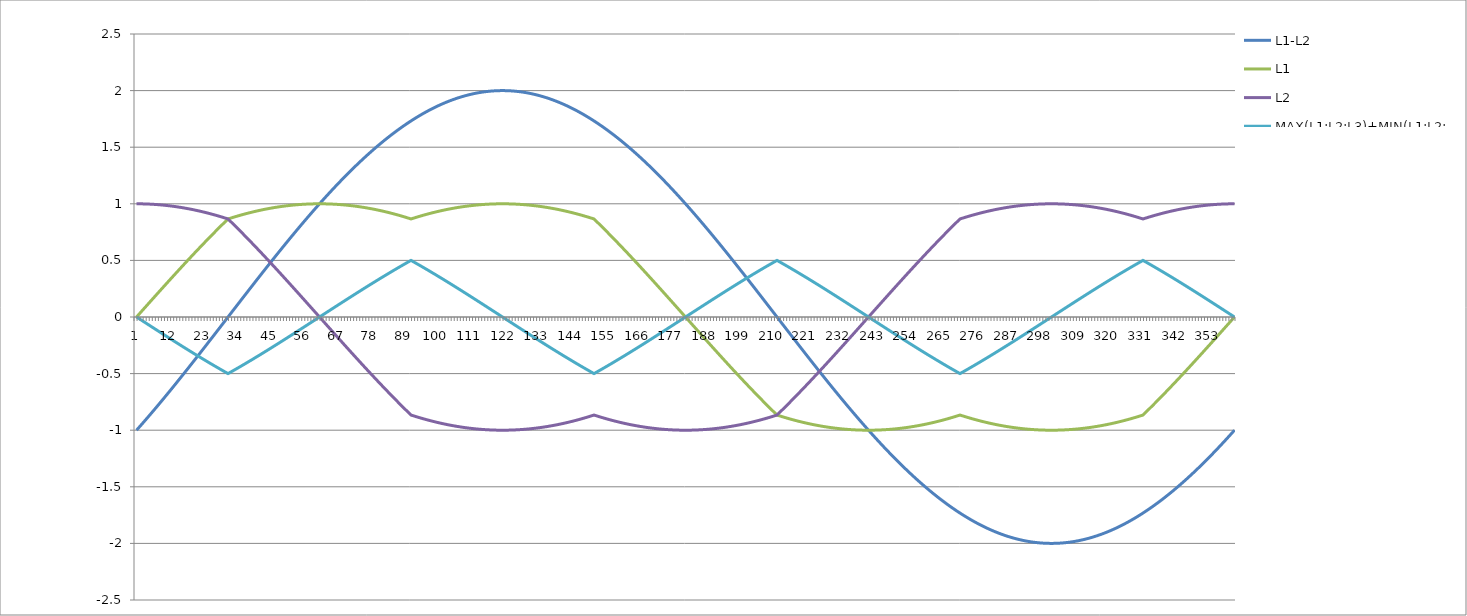
| Category | L1-L2 | L1 | L2 | MAX(L1;L2;L3)+MIN(L1;L2;L3) |
|---|---|---|---|---|
| 0 | -1 | 0 | 1 | 0 |
| 1 | -0.97 | 0.03 | 1 | -0.017 |
| 2 | -0.939 | 0.06 | 0.999 | -0.035 |
| 3 | -0.908 | 0.091 | 0.999 | -0.052 |
| 4 | -0.877 | 0.121 | 0.998 | -0.07 |
| 5 | -0.845 | 0.151 | 0.996 | -0.087 |
| 6 | -0.813 | 0.181 | 0.995 | -0.105 |
| 7 | -0.781 | 0.211 | 0.993 | -0.122 |
| 8 | -0.749 | 0.241 | 0.99 | -0.139 |
| 9 | -0.717 | 0.271 | 0.988 | -0.156 |
| 10 | -0.684 | 0.301 | 0.985 | -0.174 |
| 11 | -0.651 | 0.33 | 0.982 | -0.191 |
| 12 | -0.618 | 0.36 | 0.978 | -0.208 |
| 13 | -0.585 | 0.39 | 0.974 | -0.225 |
| 14 | -0.551 | 0.419 | 0.97 | -0.242 |
| 15 | -0.518 | 0.448 | 0.966 | -0.259 |
| 16 | -0.484 | 0.477 | 0.961 | -0.276 |
| 17 | -0.45 | 0.506 | 0.956 | -0.292 |
| 18 | -0.416 | 0.535 | 0.951 | -0.309 |
| 19 | -0.382 | 0.564 | 0.946 | -0.326 |
| 20 | -0.347 | 0.592 | 0.94 | -0.342 |
| 21 | -0.313 | 0.621 | 0.934 | -0.358 |
| 22 | -0.278 | 0.649 | 0.927 | -0.375 |
| 23 | -0.244 | 0.677 | 0.921 | -0.391 |
| 24 | -0.209 | 0.704 | 0.914 | -0.407 |
| 25 | -0.174 | 0.732 | 0.906 | -0.423 |
| 26 | -0.14 | 0.759 | 0.899 | -0.438 |
| 27 | -0.105 | 0.786 | 0.891 | -0.454 |
| 28 | -0.07 | 0.813 | 0.883 | -0.469 |
| 29 | -0.035 | 0.84 | 0.875 | -0.485 |
| 30 | 0 | 0.866 | 0.866 | -0.5 |
| 31 | 0.035 | 0.875 | 0.84 | -0.485 |
| 32 | 0.07 | 0.883 | 0.813 | -0.469 |
| 33 | 0.105 | 0.891 | 0.786 | -0.454 |
| 34 | 0.14 | 0.899 | 0.759 | -0.438 |
| 35 | 0.174 | 0.906 | 0.732 | -0.423 |
| 36 | 0.209 | 0.914 | 0.704 | -0.407 |
| 37 | 0.244 | 0.921 | 0.677 | -0.391 |
| 38 | 0.278 | 0.927 | 0.649 | -0.375 |
| 39 | 0.313 | 0.934 | 0.621 | -0.358 |
| 40 | 0.347 | 0.94 | 0.592 | -0.342 |
| 41 | 0.382 | 0.946 | 0.564 | -0.326 |
| 42 | 0.416 | 0.951 | 0.535 | -0.309 |
| 43 | 0.45 | 0.956 | 0.506 | -0.292 |
| 44 | 0.484 | 0.961 | 0.477 | -0.276 |
| 45 | 0.518 | 0.966 | 0.448 | -0.259 |
| 46 | 0.551 | 0.97 | 0.419 | -0.242 |
| 47 | 0.585 | 0.974 | 0.39 | -0.225 |
| 48 | 0.618 | 0.978 | 0.36 | -0.208 |
| 49 | 0.651 | 0.982 | 0.33 | -0.191 |
| 50 | 0.684 | 0.985 | 0.301 | -0.174 |
| 51 | 0.717 | 0.988 | 0.271 | -0.156 |
| 52 | 0.749 | 0.99 | 0.241 | -0.139 |
| 53 | 0.781 | 0.993 | 0.211 | -0.122 |
| 54 | 0.813 | 0.995 | 0.181 | -0.105 |
| 55 | 0.845 | 0.996 | 0.151 | -0.087 |
| 56 | 0.877 | 0.998 | 0.121 | -0.07 |
| 57 | 0.908 | 0.999 | 0.091 | -0.052 |
| 58 | 0.939 | 0.999 | 0.06 | -0.035 |
| 59 | 0.97 | 1 | 0.03 | -0.017 |
| 60 | 1 | 1 | 0 | 0 |
| 61 | 1.03 | 1 | -0.03 | 0.017 |
| 62 | 1.06 | 0.999 | -0.06 | 0.035 |
| 63 | 1.089 | 0.999 | -0.091 | 0.052 |
| 64 | 1.118 | 0.998 | -0.121 | 0.07 |
| 65 | 1.147 | 0.996 | -0.151 | 0.087 |
| 66 | 1.176 | 0.995 | -0.181 | 0.105 |
| 67 | 1.204 | 0.993 | -0.211 | 0.122 |
| 68 | 1.231 | 0.99 | -0.241 | 0.139 |
| 69 | 1.259 | 0.988 | -0.271 | 0.156 |
| 70 | 1.286 | 0.985 | -0.301 | 0.174 |
| 71 | 1.312 | 0.982 | -0.33 | 0.191 |
| 72 | 1.338 | 0.978 | -0.36 | 0.208 |
| 73 | 1.364 | 0.974 | -0.39 | 0.225 |
| 74 | 1.389 | 0.97 | -0.419 | 0.242 |
| 75 | 1.414 | 0.966 | -0.448 | 0.259 |
| 76 | 1.439 | 0.961 | -0.477 | 0.276 |
| 77 | 1.463 | 0.956 | -0.506 | 0.292 |
| 78 | 1.486 | 0.951 | -0.535 | 0.309 |
| 79 | 1.509 | 0.946 | -0.564 | 0.326 |
| 80 | 1.532 | 0.94 | -0.592 | 0.342 |
| 81 | 1.554 | 0.934 | -0.621 | 0.358 |
| 82 | 1.576 | 0.927 | -0.649 | 0.375 |
| 83 | 1.597 | 0.921 | -0.677 | 0.391 |
| 84 | 1.618 | 0.914 | -0.704 | 0.407 |
| 85 | 1.638 | 0.906 | -0.732 | 0.423 |
| 86 | 1.658 | 0.899 | -0.759 | 0.438 |
| 87 | 1.677 | 0.891 | -0.786 | 0.454 |
| 88 | 1.696 | 0.883 | -0.813 | 0.469 |
| 89 | 1.714 | 0.875 | -0.84 | 0.485 |
| 90 | 1.732 | 0.866 | -0.866 | 0.5 |
| 91 | 1.749 | 0.875 | -0.875 | 0.485 |
| 92 | 1.766 | 0.883 | -0.883 | 0.469 |
| 93 | 1.782 | 0.891 | -0.891 | 0.454 |
| 94 | 1.798 | 0.899 | -0.899 | 0.438 |
| 95 | 1.813 | 0.906 | -0.906 | 0.423 |
| 96 | 1.827 | 0.914 | -0.914 | 0.407 |
| 97 | 1.841 | 0.921 | -0.921 | 0.391 |
| 98 | 1.854 | 0.927 | -0.927 | 0.375 |
| 99 | 1.867 | 0.934 | -0.934 | 0.358 |
| 100 | 1.879 | 0.94 | -0.94 | 0.342 |
| 101 | 1.891 | 0.946 | -0.946 | 0.326 |
| 102 | 1.902 | 0.951 | -0.951 | 0.309 |
| 103 | 1.913 | 0.956 | -0.956 | 0.292 |
| 104 | 1.923 | 0.961 | -0.961 | 0.276 |
| 105 | 1.932 | 0.966 | -0.966 | 0.259 |
| 106 | 1.941 | 0.97 | -0.97 | 0.242 |
| 107 | 1.949 | 0.974 | -0.974 | 0.225 |
| 108 | 1.956 | 0.978 | -0.978 | 0.208 |
| 109 | 1.963 | 0.982 | -0.982 | 0.191 |
| 110 | 1.97 | 0.985 | -0.985 | 0.174 |
| 111 | 1.975 | 0.988 | -0.988 | 0.156 |
| 112 | 1.981 | 0.99 | -0.99 | 0.139 |
| 113 | 1.985 | 0.993 | -0.993 | 0.122 |
| 114 | 1.989 | 0.995 | -0.995 | 0.105 |
| 115 | 1.992 | 0.996 | -0.996 | 0.087 |
| 116 | 1.995 | 0.998 | -0.998 | 0.07 |
| 117 | 1.997 | 0.999 | -0.999 | 0.052 |
| 118 | 1.999 | 0.999 | -0.999 | 0.035 |
| 119 | 2 | 1 | -1 | 0.017 |
| 120 | 2 | 1 | -1 | 0 |
| 121 | 2 | 1 | -1 | -0.017 |
| 122 | 1.999 | 0.999 | -0.999 | -0.035 |
| 123 | 1.997 | 0.999 | -0.999 | -0.052 |
| 124 | 1.995 | 0.998 | -0.998 | -0.07 |
| 125 | 1.992 | 0.996 | -0.996 | -0.087 |
| 126 | 1.989 | 0.995 | -0.995 | -0.105 |
| 127 | 1.985 | 0.993 | -0.993 | -0.122 |
| 128 | 1.981 | 0.99 | -0.99 | -0.139 |
| 129 | 1.975 | 0.988 | -0.988 | -0.156 |
| 130 | 1.97 | 0.985 | -0.985 | -0.174 |
| 131 | 1.963 | 0.982 | -0.982 | -0.191 |
| 132 | 1.956 | 0.978 | -0.978 | -0.208 |
| 133 | 1.949 | 0.974 | -0.974 | -0.225 |
| 134 | 1.941 | 0.97 | -0.97 | -0.242 |
| 135 | 1.932 | 0.966 | -0.966 | -0.259 |
| 136 | 1.923 | 0.961 | -0.961 | -0.276 |
| 137 | 1.913 | 0.956 | -0.956 | -0.292 |
| 138 | 1.902 | 0.951 | -0.951 | -0.309 |
| 139 | 1.891 | 0.946 | -0.946 | -0.326 |
| 140 | 1.879 | 0.94 | -0.94 | -0.342 |
| 141 | 1.867 | 0.934 | -0.934 | -0.358 |
| 142 | 1.854 | 0.927 | -0.927 | -0.375 |
| 143 | 1.841 | 0.921 | -0.921 | -0.391 |
| 144 | 1.827 | 0.914 | -0.914 | -0.407 |
| 145 | 1.813 | 0.906 | -0.906 | -0.423 |
| 146 | 1.798 | 0.899 | -0.899 | -0.438 |
| 147 | 1.782 | 0.891 | -0.891 | -0.454 |
| 148 | 1.766 | 0.883 | -0.883 | -0.469 |
| 149 | 1.749 | 0.875 | -0.875 | -0.485 |
| 150 | 1.732 | 0.866 | -0.866 | -0.5 |
| 151 | 1.714 | 0.84 | -0.875 | -0.485 |
| 152 | 1.696 | 0.813 | -0.883 | -0.469 |
| 153 | 1.677 | 0.786 | -0.891 | -0.454 |
| 154 | 1.658 | 0.759 | -0.899 | -0.438 |
| 155 | 1.638 | 0.732 | -0.906 | -0.423 |
| 156 | 1.618 | 0.704 | -0.914 | -0.407 |
| 157 | 1.597 | 0.677 | -0.921 | -0.391 |
| 158 | 1.576 | 0.649 | -0.927 | -0.375 |
| 159 | 1.554 | 0.621 | -0.934 | -0.358 |
| 160 | 1.532 | 0.592 | -0.94 | -0.342 |
| 161 | 1.509 | 0.564 | -0.946 | -0.326 |
| 162 | 1.486 | 0.535 | -0.951 | -0.309 |
| 163 | 1.463 | 0.506 | -0.956 | -0.292 |
| 164 | 1.439 | 0.477 | -0.961 | -0.276 |
| 165 | 1.414 | 0.448 | -0.966 | -0.259 |
| 166 | 1.389 | 0.419 | -0.97 | -0.242 |
| 167 | 1.364 | 0.39 | -0.974 | -0.225 |
| 168 | 1.338 | 0.36 | -0.978 | -0.208 |
| 169 | 1.312 | 0.33 | -0.982 | -0.191 |
| 170 | 1.286 | 0.301 | -0.985 | -0.174 |
| 171 | 1.259 | 0.271 | -0.988 | -0.156 |
| 172 | 1.231 | 0.241 | -0.99 | -0.139 |
| 173 | 1.204 | 0.211 | -0.993 | -0.122 |
| 174 | 1.176 | 0.181 | -0.995 | -0.105 |
| 175 | 1.147 | 0.151 | -0.996 | -0.087 |
| 176 | 1.118 | 0.121 | -0.998 | -0.07 |
| 177 | 1.089 | 0.091 | -0.999 | -0.052 |
| 178 | 1.06 | 0.06 | -0.999 | -0.035 |
| 179 | 1.03 | 0.03 | -1 | -0.017 |
| 180 | 1 | 0 | -1 | 0 |
| 181 | 0.97 | -0.03 | -1 | 0.017 |
| 182 | 0.939 | -0.06 | -0.999 | 0.035 |
| 183 | 0.908 | -0.091 | -0.999 | 0.052 |
| 184 | 0.877 | -0.121 | -0.998 | 0.07 |
| 185 | 0.845 | -0.151 | -0.996 | 0.087 |
| 186 | 0.813 | -0.181 | -0.995 | 0.105 |
| 187 | 0.781 | -0.211 | -0.993 | 0.122 |
| 188 | 0.749 | -0.241 | -0.99 | 0.139 |
| 189 | 0.717 | -0.271 | -0.988 | 0.156 |
| 190 | 0.684 | -0.301 | -0.985 | 0.174 |
| 191 | 0.651 | -0.33 | -0.982 | 0.191 |
| 192 | 0.618 | -0.36 | -0.978 | 0.208 |
| 193 | 0.585 | -0.39 | -0.974 | 0.225 |
| 194 | 0.551 | -0.419 | -0.97 | 0.242 |
| 195 | 0.518 | -0.448 | -0.966 | 0.259 |
| 196 | 0.484 | -0.477 | -0.961 | 0.276 |
| 197 | 0.45 | -0.506 | -0.956 | 0.292 |
| 198 | 0.416 | -0.535 | -0.951 | 0.309 |
| 199 | 0.382 | -0.564 | -0.946 | 0.326 |
| 200 | 0.347 | -0.592 | -0.94 | 0.342 |
| 201 | 0.313 | -0.621 | -0.934 | 0.358 |
| 202 | 0.278 | -0.649 | -0.927 | 0.375 |
| 203 | 0.244 | -0.677 | -0.921 | 0.391 |
| 204 | 0.209 | -0.704 | -0.914 | 0.407 |
| 205 | 0.174 | -0.732 | -0.906 | 0.423 |
| 206 | 0.14 | -0.759 | -0.899 | 0.438 |
| 207 | 0.105 | -0.786 | -0.891 | 0.454 |
| 208 | 0.07 | -0.813 | -0.883 | 0.469 |
| 209 | 0.035 | -0.84 | -0.875 | 0.485 |
| 210 | 0 | -0.866 | -0.866 | 0.5 |
| 211 | -0.035 | -0.875 | -0.84 | 0.485 |
| 212 | -0.07 | -0.883 | -0.813 | 0.469 |
| 213 | -0.105 | -0.891 | -0.786 | 0.454 |
| 214 | -0.14 | -0.899 | -0.759 | 0.438 |
| 215 | -0.174 | -0.906 | -0.732 | 0.423 |
| 216 | -0.209 | -0.914 | -0.704 | 0.407 |
| 217 | -0.244 | -0.921 | -0.677 | 0.391 |
| 218 | -0.278 | -0.927 | -0.649 | 0.375 |
| 219 | -0.313 | -0.934 | -0.621 | 0.358 |
| 220 | -0.347 | -0.94 | -0.592 | 0.342 |
| 221 | -0.382 | -0.946 | -0.564 | 0.326 |
| 222 | -0.416 | -0.951 | -0.535 | 0.309 |
| 223 | -0.45 | -0.956 | -0.506 | 0.292 |
| 224 | -0.484 | -0.961 | -0.477 | 0.276 |
| 225 | -0.518 | -0.966 | -0.448 | 0.259 |
| 226 | -0.551 | -0.97 | -0.419 | 0.242 |
| 227 | -0.585 | -0.974 | -0.39 | 0.225 |
| 228 | -0.618 | -0.978 | -0.36 | 0.208 |
| 229 | -0.651 | -0.982 | -0.33 | 0.191 |
| 230 | -0.684 | -0.985 | -0.301 | 0.174 |
| 231 | -0.717 | -0.988 | -0.271 | 0.156 |
| 232 | -0.749 | -0.99 | -0.241 | 0.139 |
| 233 | -0.781 | -0.993 | -0.211 | 0.122 |
| 234 | -0.813 | -0.995 | -0.181 | 0.105 |
| 235 | -0.845 | -0.996 | -0.151 | 0.087 |
| 236 | -0.877 | -0.998 | -0.121 | 0.07 |
| 237 | -0.908 | -0.999 | -0.091 | 0.052 |
| 238 | -0.939 | -0.999 | -0.06 | 0.035 |
| 239 | -0.97 | -1 | -0.03 | 0.017 |
| 240 | -1 | -1 | 0 | 0 |
| 241 | -1.03 | -1 | 0.03 | -0.017 |
| 242 | -1.06 | -0.999 | 0.06 | -0.035 |
| 243 | -1.089 | -0.999 | 0.091 | -0.052 |
| 244 | -1.118 | -0.998 | 0.121 | -0.07 |
| 245 | -1.147 | -0.996 | 0.151 | -0.087 |
| 246 | -1.176 | -0.995 | 0.181 | -0.105 |
| 247 | -1.204 | -0.993 | 0.211 | -0.122 |
| 248 | -1.231 | -0.99 | 0.241 | -0.139 |
| 249 | -1.259 | -0.988 | 0.271 | -0.156 |
| 250 | -1.286 | -0.985 | 0.301 | -0.174 |
| 251 | -1.312 | -0.982 | 0.33 | -0.191 |
| 252 | -1.338 | -0.978 | 0.36 | -0.208 |
| 253 | -1.364 | -0.974 | 0.39 | -0.225 |
| 254 | -1.389 | -0.97 | 0.419 | -0.242 |
| 255 | -1.414 | -0.966 | 0.448 | -0.259 |
| 256 | -1.439 | -0.961 | 0.477 | -0.276 |
| 257 | -1.463 | -0.956 | 0.506 | -0.292 |
| 258 | -1.486 | -0.951 | 0.535 | -0.309 |
| 259 | -1.509 | -0.946 | 0.564 | -0.326 |
| 260 | -1.532 | -0.94 | 0.592 | -0.342 |
| 261 | -1.554 | -0.934 | 0.621 | -0.358 |
| 262 | -1.576 | -0.927 | 0.649 | -0.375 |
| 263 | -1.597 | -0.921 | 0.677 | -0.391 |
| 264 | -1.618 | -0.914 | 0.704 | -0.407 |
| 265 | -1.638 | -0.906 | 0.732 | -0.423 |
| 266 | -1.658 | -0.899 | 0.759 | -0.438 |
| 267 | -1.677 | -0.891 | 0.786 | -0.454 |
| 268 | -1.696 | -0.883 | 0.813 | -0.469 |
| 269 | -1.714 | -0.875 | 0.84 | -0.485 |
| 270 | -1.732 | -0.866 | 0.866 | -0.5 |
| 271 | -1.749 | -0.875 | 0.875 | -0.485 |
| 272 | -1.766 | -0.883 | 0.883 | -0.469 |
| 273 | -1.782 | -0.891 | 0.891 | -0.454 |
| 274 | -1.798 | -0.899 | 0.899 | -0.438 |
| 275 | -1.813 | -0.906 | 0.906 | -0.423 |
| 276 | -1.827 | -0.914 | 0.914 | -0.407 |
| 277 | -1.841 | -0.921 | 0.921 | -0.391 |
| 278 | -1.854 | -0.927 | 0.927 | -0.375 |
| 279 | -1.867 | -0.934 | 0.934 | -0.358 |
| 280 | -1.879 | -0.94 | 0.94 | -0.342 |
| 281 | -1.891 | -0.946 | 0.946 | -0.326 |
| 282 | -1.902 | -0.951 | 0.951 | -0.309 |
| 283 | -1.913 | -0.956 | 0.956 | -0.292 |
| 284 | -1.923 | -0.961 | 0.961 | -0.276 |
| 285 | -1.932 | -0.966 | 0.966 | -0.259 |
| 286 | -1.941 | -0.97 | 0.97 | -0.242 |
| 287 | -1.949 | -0.974 | 0.974 | -0.225 |
| 288 | -1.956 | -0.978 | 0.978 | -0.208 |
| 289 | -1.963 | -0.982 | 0.982 | -0.191 |
| 290 | -1.97 | -0.985 | 0.985 | -0.174 |
| 291 | -1.975 | -0.988 | 0.988 | -0.156 |
| 292 | -1.981 | -0.99 | 0.99 | -0.139 |
| 293 | -1.985 | -0.993 | 0.993 | -0.122 |
| 294 | -1.989 | -0.995 | 0.995 | -0.105 |
| 295 | -1.992 | -0.996 | 0.996 | -0.087 |
| 296 | -1.995 | -0.998 | 0.998 | -0.07 |
| 297 | -1.997 | -0.999 | 0.999 | -0.052 |
| 298 | -1.999 | -0.999 | 0.999 | -0.035 |
| 299 | -2 | -1 | 1 | -0.017 |
| 300 | -2 | -1 | 1 | 0 |
| 301 | -2 | -1 | 1 | 0.017 |
| 302 | -1.999 | -0.999 | 0.999 | 0.035 |
| 303 | -1.997 | -0.999 | 0.999 | 0.052 |
| 304 | -1.995 | -0.998 | 0.998 | 0.07 |
| 305 | -1.992 | -0.996 | 0.996 | 0.087 |
| 306 | -1.989 | -0.995 | 0.995 | 0.105 |
| 307 | -1.985 | -0.993 | 0.993 | 0.122 |
| 308 | -1.981 | -0.99 | 0.99 | 0.139 |
| 309 | -1.975 | -0.988 | 0.988 | 0.156 |
| 310 | -1.97 | -0.985 | 0.985 | 0.174 |
| 311 | -1.963 | -0.982 | 0.982 | 0.191 |
| 312 | -1.956 | -0.978 | 0.978 | 0.208 |
| 313 | -1.949 | -0.974 | 0.974 | 0.225 |
| 314 | -1.941 | -0.97 | 0.97 | 0.242 |
| 315 | -1.932 | -0.966 | 0.966 | 0.259 |
| 316 | -1.923 | -0.961 | 0.961 | 0.276 |
| 317 | -1.913 | -0.956 | 0.956 | 0.292 |
| 318 | -1.902 | -0.951 | 0.951 | 0.309 |
| 319 | -1.891 | -0.946 | 0.946 | 0.326 |
| 320 | -1.879 | -0.94 | 0.94 | 0.342 |
| 321 | -1.867 | -0.934 | 0.934 | 0.358 |
| 322 | -1.854 | -0.927 | 0.927 | 0.375 |
| 323 | -1.841 | -0.921 | 0.921 | 0.391 |
| 324 | -1.827 | -0.914 | 0.914 | 0.407 |
| 325 | -1.813 | -0.906 | 0.906 | 0.423 |
| 326 | -1.798 | -0.899 | 0.899 | 0.438 |
| 327 | -1.782 | -0.891 | 0.891 | 0.454 |
| 328 | -1.766 | -0.883 | 0.883 | 0.469 |
| 329 | -1.749 | -0.875 | 0.875 | 0.485 |
| 330 | -1.732 | -0.866 | 0.866 | 0.5 |
| 331 | -1.714 | -0.84 | 0.875 | 0.485 |
| 332 | -1.696 | -0.813 | 0.883 | 0.469 |
| 333 | -1.677 | -0.786 | 0.891 | 0.454 |
| 334 | -1.658 | -0.759 | 0.899 | 0.438 |
| 335 | -1.638 | -0.732 | 0.906 | 0.423 |
| 336 | -1.618 | -0.704 | 0.914 | 0.407 |
| 337 | -1.597 | -0.677 | 0.921 | 0.391 |
| 338 | -1.576 | -0.649 | 0.927 | 0.375 |
| 339 | -1.554 | -0.621 | 0.934 | 0.358 |
| 340 | -1.532 | -0.592 | 0.94 | 0.342 |
| 341 | -1.509 | -0.564 | 0.946 | 0.326 |
| 342 | -1.486 | -0.535 | 0.951 | 0.309 |
| 343 | -1.463 | -0.506 | 0.956 | 0.292 |
| 344 | -1.439 | -0.477 | 0.961 | 0.276 |
| 345 | -1.414 | -0.448 | 0.966 | 0.259 |
| 346 | -1.389 | -0.419 | 0.97 | 0.242 |
| 347 | -1.364 | -0.39 | 0.974 | 0.225 |
| 348 | -1.338 | -0.36 | 0.978 | 0.208 |
| 349 | -1.312 | -0.33 | 0.982 | 0.191 |
| 350 | -1.286 | -0.301 | 0.985 | 0.174 |
| 351 | -1.259 | -0.271 | 0.988 | 0.156 |
| 352 | -1.231 | -0.241 | 0.99 | 0.139 |
| 353 | -1.204 | -0.211 | 0.993 | 0.122 |
| 354 | -1.176 | -0.181 | 0.995 | 0.105 |
| 355 | -1.147 | -0.151 | 0.996 | 0.087 |
| 356 | -1.118 | -0.121 | 0.998 | 0.07 |
| 357 | -1.089 | -0.091 | 0.999 | 0.052 |
| 358 | -1.06 | -0.06 | 0.999 | 0.035 |
| 359 | -1.03 | -0.03 | 1 | 0.017 |
| 360 | -1 | 0 | 1 | 0 |